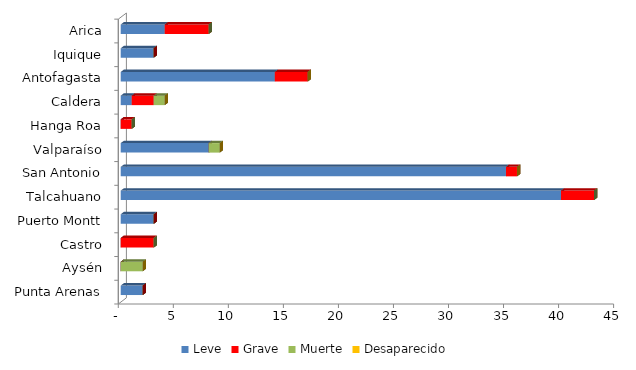
| Category | Leve | Grave | Muerte | Desaparecido |
|---|---|---|---|---|
| Arica | 4 | 4 | 0 | 0 |
| Iquique | 3 | 0 | 0 | 0 |
| Antofagasta | 14 | 3 | 0 | 0 |
| Caldera | 1 | 2 | 1 | 0 |
| Hanga Roa | 0 | 1 | 0 | 0 |
| Valparaíso | 8 | 0 | 1 | 0 |
| San Antonio | 35 | 1 | 0 | 0 |
| Talcahuano | 40 | 3 | 0 | 0 |
| Puerto Montt | 3 | 0 | 0 | 0 |
| Castro | 0 | 3 | 0 | 0 |
| Aysén | 0 | 0 | 2 | 0 |
| Punta Arenas | 2 | 0 | 0 | 0 |